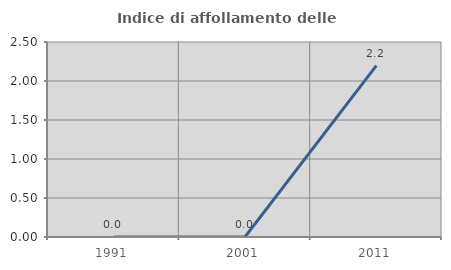
| Category | Indice di affollamento delle abitazioni  |
|---|---|
| 1991.0 | 0 |
| 2001.0 | 0 |
| 2011.0 | 2.198 |